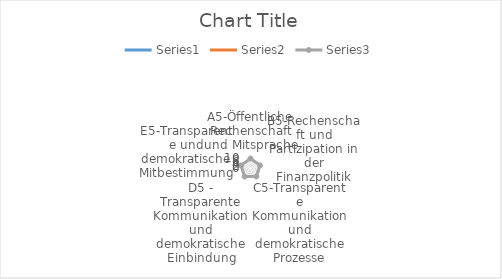
| Category | Series 0 | Series 1 | Series 2 |
|---|---|---|---|
| A5-Öffentliche Rechenschaft und Mitsprache | 0 | 0 | 10 |
| B5-Rechenschaft und Partizipation in der Finanzpolitik | 0 | 0 | 10 |
| C5-Transparente Kommunikation und demokratische Prozesse | 0 | 0 | 10 |
| D5 - Transparente Kommunikation und demokratische Einbindung | 0 | 0 | 10 |
| E5-Transparente und demokratische Mitbestimmung | 0 | 0 | 10 |